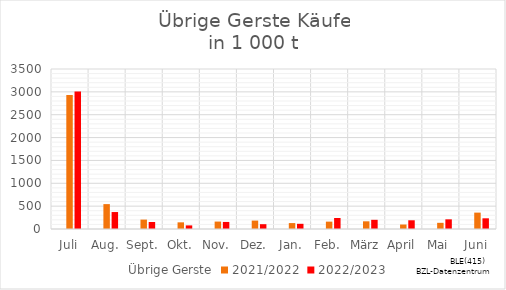
| Category | Übrige Gerste | 2021/2022 | 2022/2023 |
|---|---|---|---|
| Juli |  | 2933.058 | 3009.957 |
| Aug. |  | 544.337 | 370.858 |
| Sept. |  | 205.685 | 152.81 |
| Okt. |  | 145.756 | 78.771 |
| Nov. |  | 162.775 | 154.414 |
| Dez. |  | 183.862 | 105.214 |
| Jan. |  | 129.529 | 113.64 |
| Feb. |  | 161.316 | 240.91 |
| März |  | 168.187 | 200.785 |
| April |  | 98.098 | 190.783 |
| Mai |  | 135.28 | 211.619 |
| Juni |  | 358.443 | 233.857 |